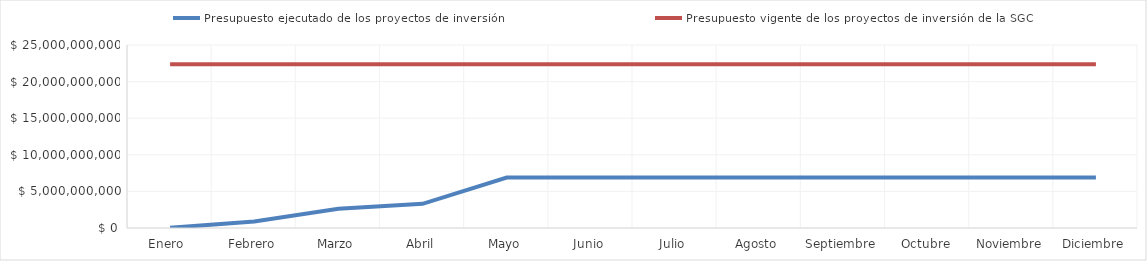
| Category | Presupuesto ejecutado de los proyectos de inversión | Presupuesto vigente de los proyectos de inversión de la SGC |
|---|---|---|
| Enero  | 31560000 | 22376132000 |
| Febrero | 880745716 | 22376132000 |
| Marzo | 2643653567 | 22376132000 |
| Abril | 3301607825 | 22376132000 |
| Mayo | 6884621463 | 22376132000 |
| Junio | 6884621463 | 22376132000 |
| Julio | 6884621463 | 22376132000 |
| Agosto | 6884621463 | 22376132000 |
| Septiembre | 6884621463 | 22376132000 |
| Octubre | 6884621463 | 22376132000 |
| Noviembre | 6884621463 | 22376132000 |
| Diciembre | 6884621463 | 22376132000 |